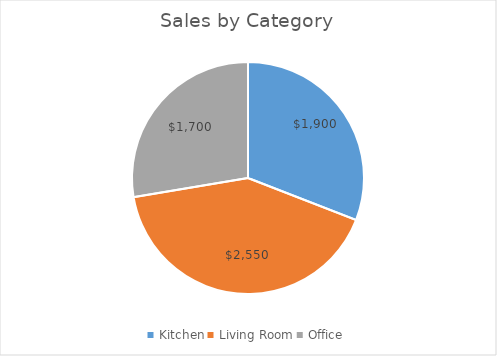
| Category | Total |
|---|---|
| Kitchen | 1900 |
| Living Room | 2550 |
| Office | 1700 |